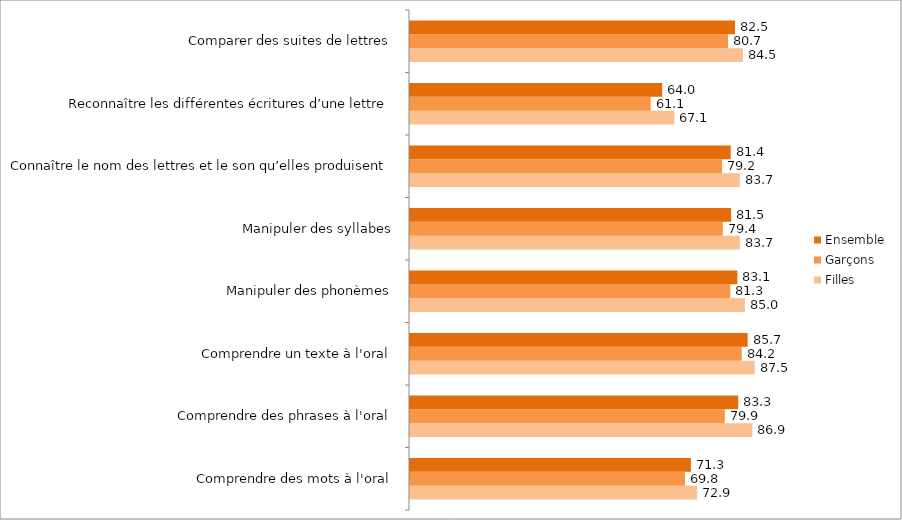
| Category | Filles | Garçons | Ensemble |
|---|---|---|---|
| Comprendre des mots à l'oral | 72.9 | 69.8 | 71.3 |
| Comprendre des phrases à l'oral | 86.9 | 79.9 | 83.3 |
| Comprendre un texte à l'oral | 87.5 | 84.2 | 85.7 |
| Manipuler des phonèmes | 85 | 81.3 | 83.1 |
| Manipuler des syllabes | 83.7 | 79.4 | 81.5 |
| Connaître le nom des lettres et le son qu’elles produisent | 83.7 | 79.2 | 81.4 |
| Reconnaître les différentes écritures d’une lettre | 67.1 | 61.1 | 64 |
| Comparer des suites de lettres | 84.5 | 80.7 | 82.5 |